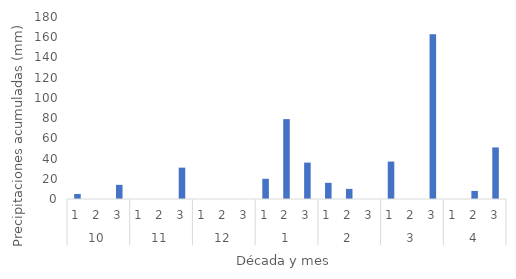
| Category | Suma PP |
|---|---|
| 0 | 5 |
| 1 | 0 |
| 2 | 14 |
| 3 | 0 |
| 4 | 0 |
| 5 | 31 |
| 6 | 0 |
| 7 | 0 |
| 8 | 0 |
| 9 | 20 |
| 10 | 79 |
| 11 | 36 |
| 12 | 16 |
| 13 | 10 |
| 14 | 0 |
| 15 | 37 |
| 16 | 0 |
| 17 | 163 |
| 18 | 0 |
| 19 | 8 |
| 20 | 51 |